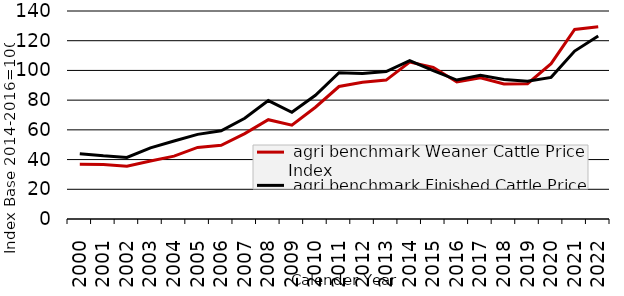
| Category |  agri benchmark Weaner Cattle Price Index |  agri benchmark Finished Cattle Price Index |
|---|---|---|
| 2000.0 | 36.776 | 43.97 |
| 2001.0 | 36.61 | 42.513 |
| 2002.0 | 35.583 | 41.441 |
| 2003.0 | 39.002 | 47.897 |
| 2004.0 | 42.321 | 52.462 |
| 2005.0 | 48.182 | 56.957 |
| 2006.0 | 49.644 | 59.329 |
| 2007.0 | 57.504 | 67.797 |
| 2008.0 | 66.826 | 79.716 |
| 2009.0 | 63.139 | 71.84 |
| 2010.0 | 75.222 | 83.231 |
| 2011.0 | 89.174 | 98.479 |
| 2012.0 | 92.039 | 97.929 |
| 2013.0 | 93.504 | 99.271 |
| 2014.0 | 105.653 | 106.57 |
| 2015.0 | 102.11 | 99.909 |
| 2016.0 | 92.238 | 93.521 |
| 2017.0 | 94.981 | 96.709 |
| 2018.0 | 90.863 | 93.877 |
| 2019.0 | 91.091 | 92.705 |
| 2020.0 | 104.517 | 95.331 |
| 2021.0 | 127.536 | 113.047 |
| 2022.0 | 129.372 | 123.109 |